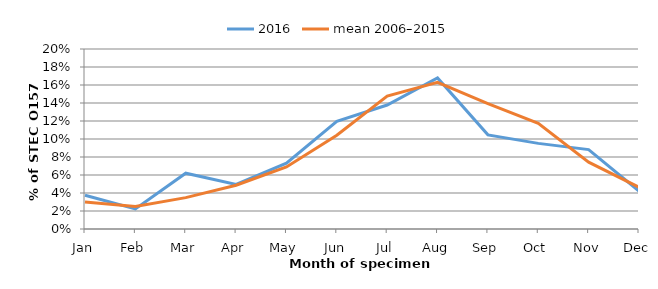
| Category | 2016 | mean 2006–2015 |
|---|---|---|
| Jan | 0.037 | 0.03 |
| Feb | 0.022 | 0.025 |
| Mar | 0.062 | 0.035 |
| Apr | 0.05 | 0.049 |
| May | 0.073 | 0.069 |
| Jun | 0.12 | 0.104 |
| Jul | 0.138 | 0.148 |
| Aug | 0.168 | 0.163 |
| Sep | 0.105 | 0.139 |
| Oct | 0.095 | 0.117 |
| Nov | 0.088 | 0.074 |
| Dec | 0.042 | 0.046 |